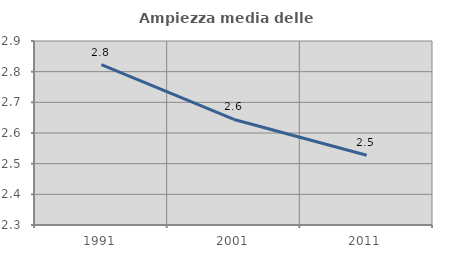
| Category | Ampiezza media delle famiglie |
|---|---|
| 1991.0 | 2.823 |
| 2001.0 | 2.644 |
| 2011.0 | 2.527 |